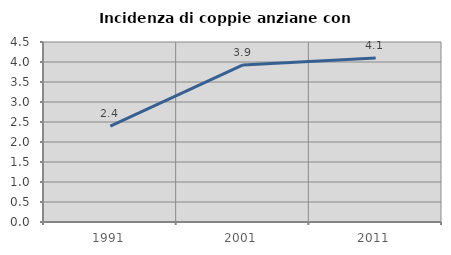
| Category | Incidenza di coppie anziane con figli |
|---|---|
| 1991.0 | 2.398 |
| 2001.0 | 3.927 |
| 2011.0 | 4.099 |